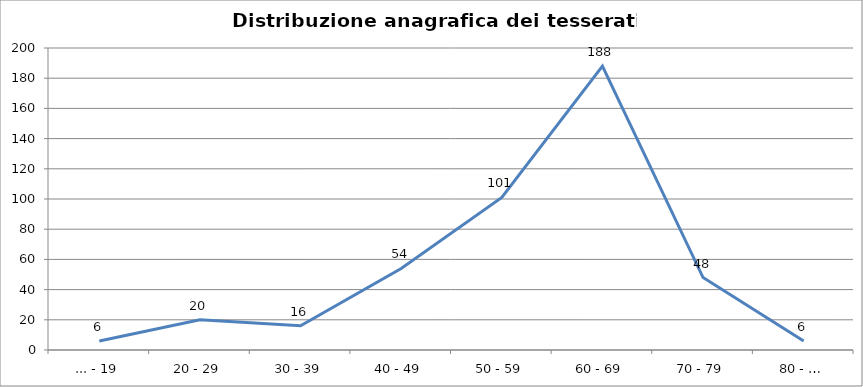
| Category | Nr. Tesserati |
|---|---|
| ... - 19 | 6 |
| 20 - 29 | 20 |
| 30 - 39 | 16 |
| 40 - 49 | 54 |
| 50 - 59 | 101 |
| 60 - 69 | 188 |
| 70 - 79 | 48 |
| 80 - … | 6 |